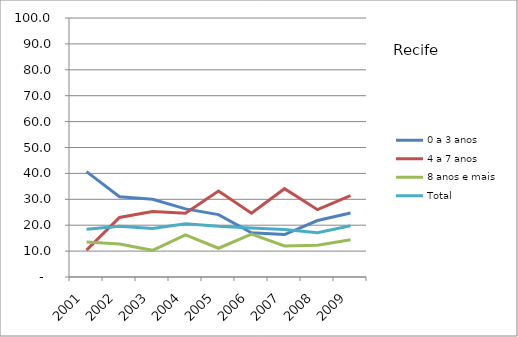
| Category | 0 a 3 anos | 4 a 7 anos | 8 anos e mais | Total |
|---|---|---|---|---|
| 2001.0 | 40.7 | 10.4 | 13.5 | 18.4 |
| 2002.0 | 31 | 23 | 12.7 | 19.6 |
| 2003.0 | 30 | 25.3 | 10.3 | 18.7 |
| 2004.0 | 26.3 | 24.6 | 16.3 | 20.6 |
| 2005.0 | 24.1 | 33.2 | 11.1 | 19.6 |
| 2006.0 | 17.1 | 24.6 | 16.6 | 18.9 |
| 2007.0 | 16.4 | 34.1 | 12 | 18.3 |
| 2008.0 | 21.8 | 26 | 12.3 | 17.1 |
| 2009.0 | 24.7 | 31.4 | 14.4 | 19.8 |